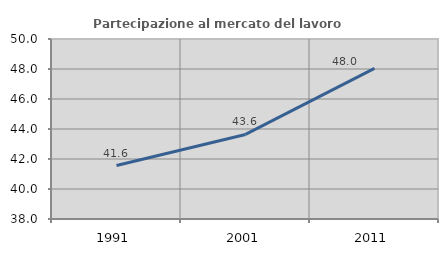
| Category | Partecipazione al mercato del lavoro  femminile |
|---|---|
| 1991.0 | 41.564 |
| 2001.0 | 43.638 |
| 2011.0 | 48.041 |